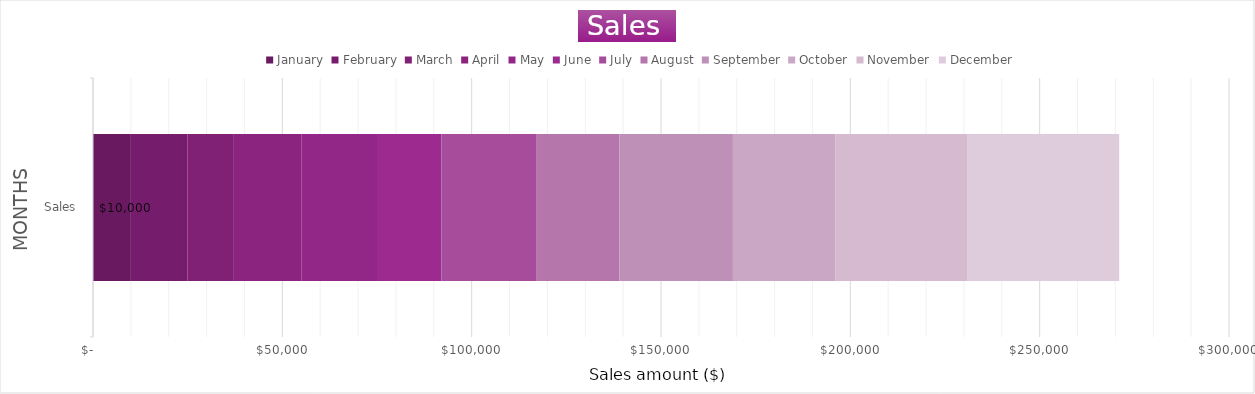
| Category | January | February | March | April | May | June | July | August | September | October | November | December |
|---|---|---|---|---|---|---|---|---|---|---|---|---|
|  Sales  | 10000 | 15000 | 12000 | 18000 | 20000 | 17000 | 25000 | 22000 | 30000 | 27000 | 35000 | 40000 |